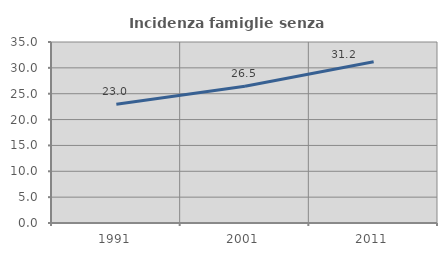
| Category | Incidenza famiglie senza nuclei |
|---|---|
| 1991.0 | 22.976 |
| 2001.0 | 26.454 |
| 2011.0 | 31.164 |